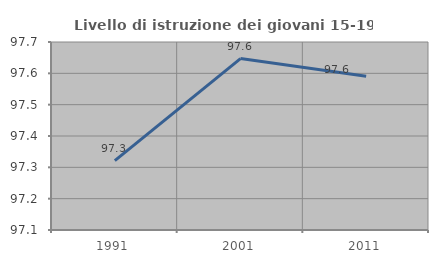
| Category | Livello di istruzione dei giovani 15-19 anni |
|---|---|
| 1991.0 | 97.321 |
| 2001.0 | 97.647 |
| 2011.0 | 97.59 |